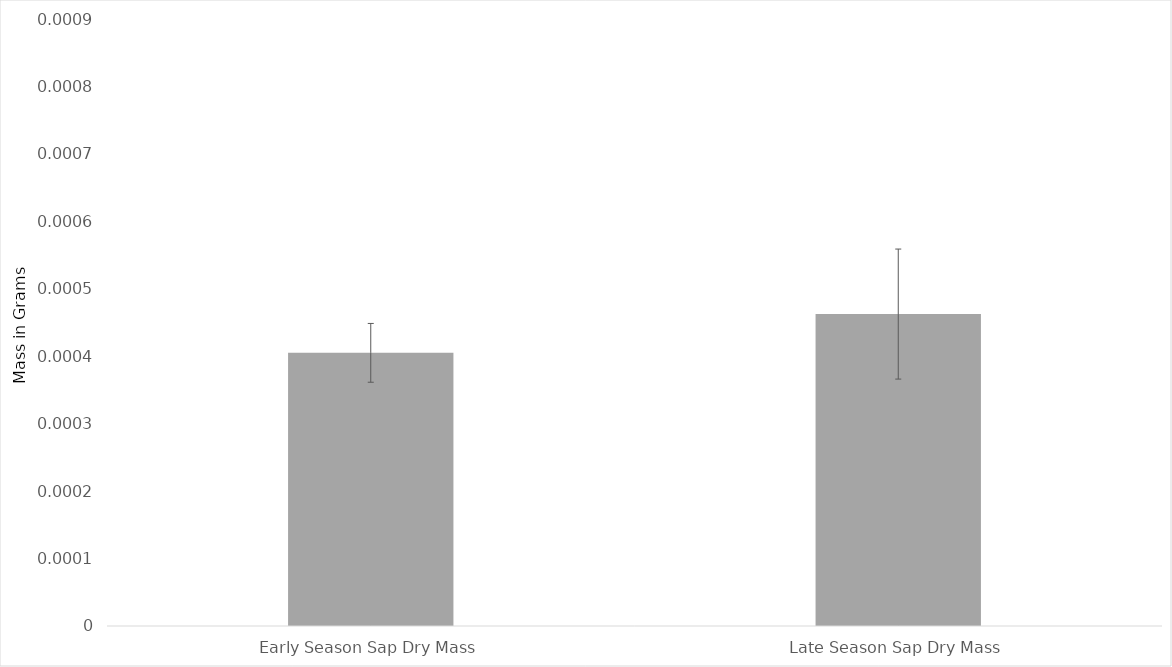
| Category | Dry Mass at 48 Hours |
|---|---|
| Early Season Sap Dry Mass | 0 |
| Late Season Sap Dry Mass | 0 |